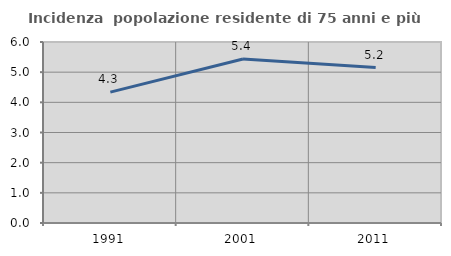
| Category | Incidenza  popolazione residente di 75 anni e più |
|---|---|
| 1991.0 | 4.337 |
| 2001.0 | 5.434 |
| 2011.0 | 5.153 |